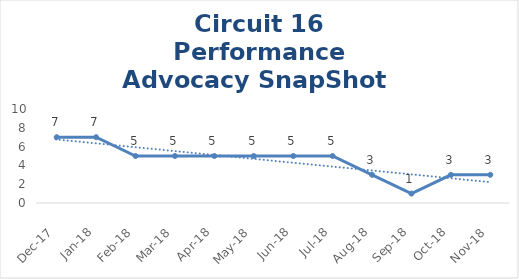
| Category | Circuit 16 |
|---|---|
| Dec-17 | 7 |
| Jan-18 | 7 |
| Feb-18 | 5 |
| Mar-18 | 5 |
| Apr-18 | 5 |
| May-18 | 5 |
| Jun-18 | 5 |
| Jul-18 | 5 |
| Aug-18 | 3 |
| Sep-18 | 1 |
| Oct-18 | 3 |
| Nov-18 | 3 |